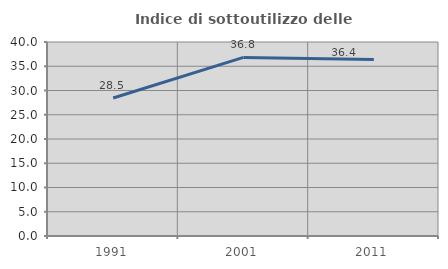
| Category | Indice di sottoutilizzo delle abitazioni  |
|---|---|
| 1991.0 | 28.454 |
| 2001.0 | 36.826 |
| 2011.0 | 36.416 |